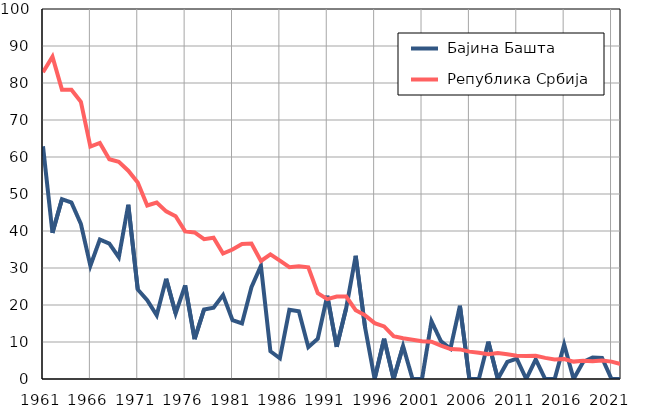
| Category |  Бајина Башта |  Република Србија |
|---|---|---|
| 1961.0 | 62.9 | 82.9 |
| 1962.0 | 39.5 | 87.1 |
| 1963.0 | 48.6 | 78.2 |
| 1964.0 | 47.7 | 78.2 |
| 1965.0 | 41.9 | 74.9 |
| 1966.0 | 30.6 | 62.8 |
| 1967.0 | 37.7 | 63.8 |
| 1968.0 | 36.6 | 59.4 |
| 1969.0 | 32.9 | 58.7 |
| 1970.0 | 47.1 | 56.3 |
| 1971.0 | 24.2 | 53.1 |
| 1972.0 | 21.3 | 46.9 |
| 1973.0 | 17.2 | 47.7 |
| 1974.0 | 27.1 | 45.3 |
| 1975.0 | 17.7 | 44 |
| 1976.0 | 25.3 | 39.9 |
| 1977.0 | 10.8 | 39.6 |
| 1978.0 | 18.8 | 37.8 |
| 1979.0 | 19.3 | 38.2 |
| 1980.0 | 22.7 | 33.9 |
| 1981.0 | 15.9 | 35 |
| 1982.0 | 15 | 36.5 |
| 1983.0 | 24.8 | 36.6 |
| 1984.0 | 30.6 | 31.9 |
| 1985.0 | 7.5 | 33.7 |
| 1986.0 | 5.6 | 32 |
| 1987.0 | 18.7 | 30.2 |
| 1988.0 | 18.3 | 30.5 |
| 1989.0 | 8.6 | 30.2 |
| 1990.0 | 10.9 | 23.2 |
| 1991.0 | 22.5 | 21.6 |
| 1992.0 | 8.7 | 22.3 |
| 1993.0 | 19.2 | 22.3 |
| 1994.0 | 33.3 | 18.6 |
| 1995.0 | 13.8 | 17.2 |
| 1996.0 | 0 | 15.1 |
| 1997.0 | 10.9 | 14.2 |
| 1998.0 | 0 | 11.6 |
| 1999.0 | 8.9 | 11 |
| 2000.0 | 0 | 10.6 |
| 2001.0 | 0 | 10.2 |
| 2002.0 | 15.6 | 10.1 |
| 2003.0 | 10.2 | 9 |
| 2004.0 | 8.2 | 8.1 |
| 2005.0 | 19.8 | 8 |
| 2006.0 | 0 | 7.4 |
| 2007.0 | 0 | 7.1 |
| 2008.0 | 10.1 | 6.7 |
| 2009.0 | 0 | 7 |
| 2010.0 | 4.6 | 6.7 |
| 2011.0 | 5.5 | 6.3 |
| 2012.0 | 0 | 6.2 |
| 2013.0 | 5.3 | 6.3 |
| 2014.0 | 0 | 5.7 |
| 2015.0 | 0 | 5.3 |
| 2016.0 | 9.3 | 5.4 |
| 2017.0 | 0 | 4.7 |
| 2018.0 | 4.6 | 4.9 |
| 2019.0 | 5.8 | 4.8 |
| 2020.0 | 5.7 | 5 |
| 2021.0 | 0 | 4.7 |
| 2022.0 | 0 | 4 |